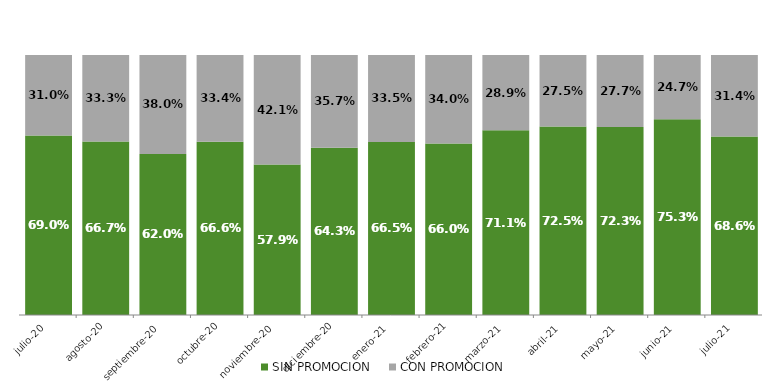
| Category | SIN PROMOCION   | CON PROMOCION   |
|---|---|---|
| 2020-07-01 | 0.69 | 0.31 |
| 2020-08-01 | 0.667 | 0.333 |
| 2020-09-01 | 0.62 | 0.38 |
| 2020-10-01 | 0.666 | 0.334 |
| 2020-11-01 | 0.579 | 0.421 |
| 2020-12-01 | 0.643 | 0.357 |
| 2021-01-01 | 0.665 | 0.335 |
| 2021-02-01 | 0.66 | 0.34 |
| 2021-03-01 | 0.711 | 0.289 |
| 2021-04-01 | 0.725 | 0.275 |
| 2021-05-01 | 0.723 | 0.277 |
| 2021-06-01 | 0.753 | 0.247 |
| 2021-07-01 | 0.686 | 0.314 |